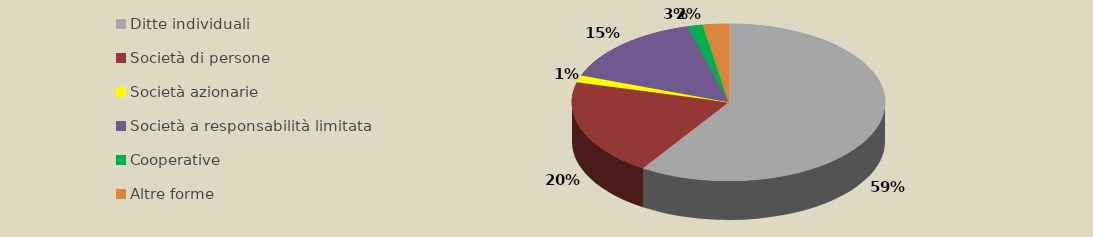
| Category | Series 0 |
|---|---|
| Ditte individuali | 20824 |
| Società di persone | 7016 |
| Società azionarie | 514 |
| Società a responsabilità limitata | 5342 |
| Cooperative | 559 |
| Altre forme | 934 |